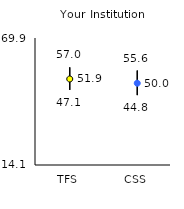
| Category | 25th | 75th | Mean |
|---|---|---|---|
| TFS | 47.1 | 57 | 51.89 |
| CSS | 44.8 | 55.6 | 50.03 |